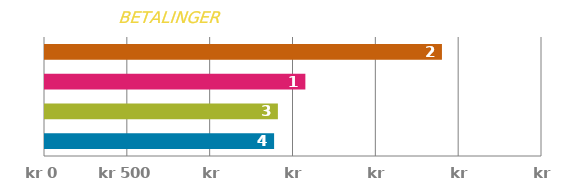
| Category | BETALING |
|---|---|
| 0 | 1382.921 |
| 1 | 1405.775 |
| 2 | 1571.655 |
| 3 | 2396.046 |